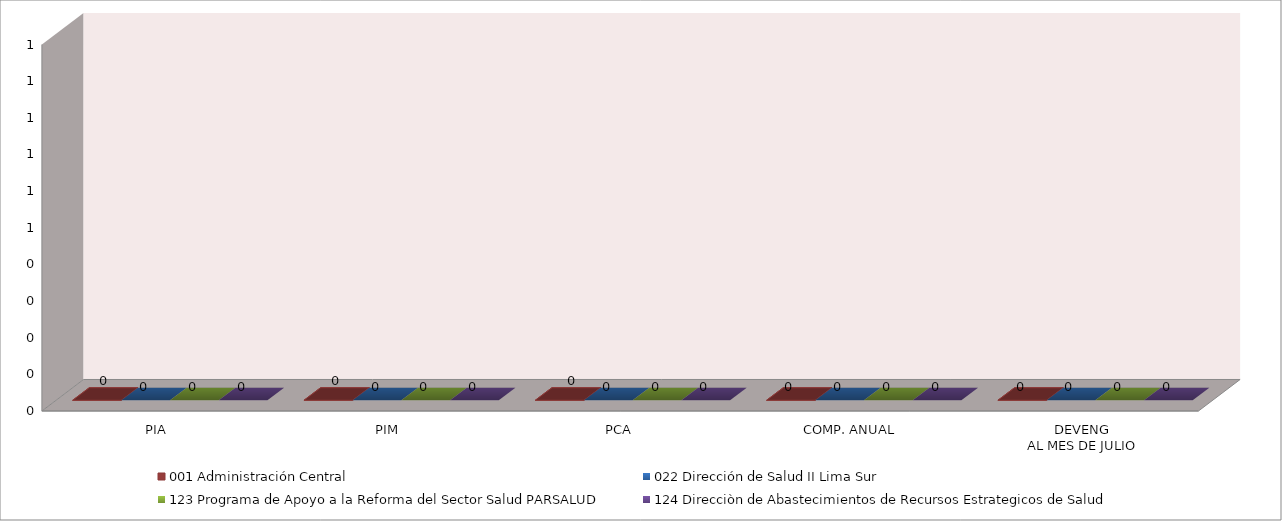
| Category | 001 Administración Central | 022 Dirección de Salud II Lima Sur | 123 Programa de Apoyo a la Reforma del Sector Salud PARSALUD | 124 Direcciòn de Abastecimientos de Recursos Estrategicos de Salud |
|---|---|---|---|---|
| PIA | 0 | 0 | 0 | 0 |
| PIM | 0 | 0 | 0 | 0 |
| PCA | 0 | 0 | 0 | 0 |
| COMP. ANUAL | 0 | 0 | 0 | 0 |
| DEVENG
AL MES DE JULIO | 0 | 0 | 0 | 0 |